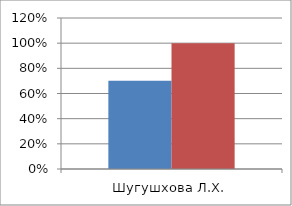
| Category | Series 0 | 2 |
|---|---|---|
| Шугушхова Л.Х. | 0.701 | 1 |